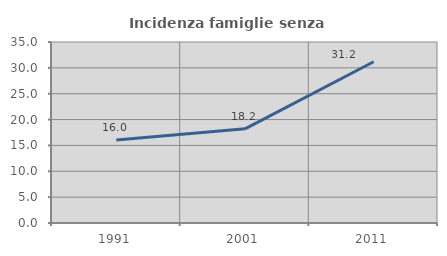
| Category | Incidenza famiglie senza nuclei |
|---|---|
| 1991.0 | 16.031 |
| 2001.0 | 18.204 |
| 2011.0 | 31.174 |